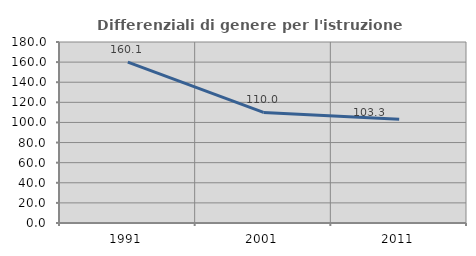
| Category | Differenziali di genere per l'istruzione superiore |
|---|---|
| 1991.0 | 160.059 |
| 2001.0 | 109.954 |
| 2011.0 | 103.284 |